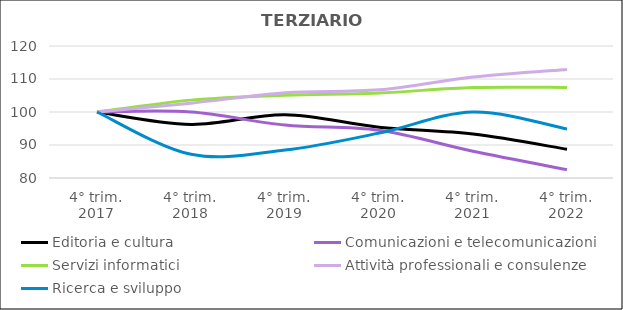
| Category | Editoria e cultura  | Comunicazioni e telecomunicazioni  | Servizi informatici  | Attività professionali e consulenze  | Ricerca e sviluppo |
|---|---|---|---|---|---|
| 4° trim.
2017 | 100 | 100 | 100 | 100 | 100 |
| 4° trim.
2018 | 96.234 | 100 | 103.598 | 102.662 | 87.179 |
| 4° trim.
2019 | 99.163 | 96.032 | 105.083 | 105.822 | 88.462 |
| 4° trim.
2020 | 95.397 | 94.444 | 105.768 | 106.718 | 93.59 |
| 4° trim.
2021 | 93.305 | 88.095 | 107.424 | 110.6 | 100 |
| 4° trim.
2022 | 88.703 | 82.54 | 107.424 | 112.914 | 94.872 |